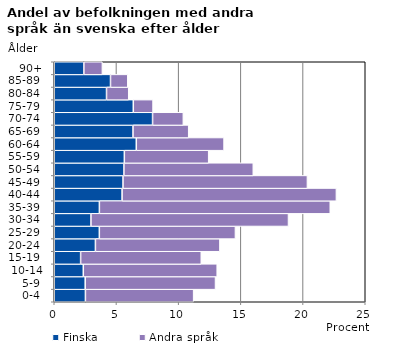
| Category | Finska | Andra språk |
|---|---|---|
|   0-4  | 2.505 | 8.699 |
|   5-9  | 2.488 | 10.475 |
| 10-14 | 2.335 | 10.763 |
| 15-19  | 2.121 | 9.697 |
| 20-24  | 3.309 | 10.008 |
| 25-29  | 3.624 | 10.941 |
| 30-34  | 2.952 | 15.878 |
| 35-39  | 3.628 | 18.559 |
| 40-44  | 5.454 | 17.227 |
| 45-49  | 5.527 | 14.824 |
| 50-54  | 5.6 | 10.4 |
| 55-59  | 5.634 | 6.78 |
| 60-64  | 6.595 | 7.055 |
| 65-69  | 6.33 | 4.478 |
| 70-74  | 7.903 | 2.473 |
| 75-79  | 6.353 | 1.588 |
| 80-84  | 4.202 | 1.786 |
| 85-89  | 4.522 | 1.391 |
| 90+ | 2.381 | 1.488 |